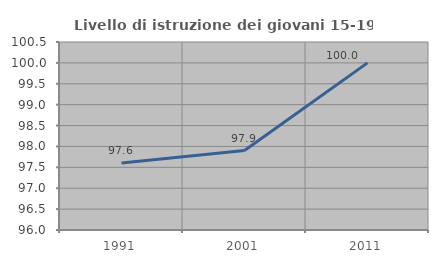
| Category | Livello di istruzione dei giovani 15-19 anni |
|---|---|
| 1991.0 | 97.605 |
| 2001.0 | 97.902 |
| 2011.0 | 100 |